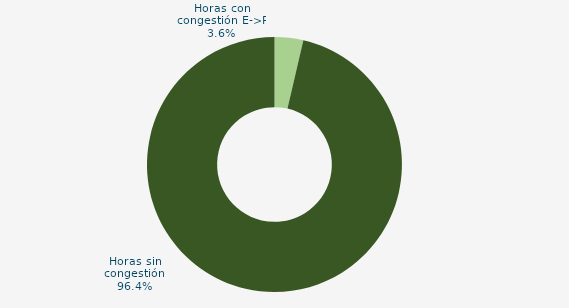
| Category | Horas con congestión E->P |
|---|---|
| Horas con congestión E->P | 3.634 |
| Horas con congestión P->E | 0 |
| Horas sin congestión | 96.366 |